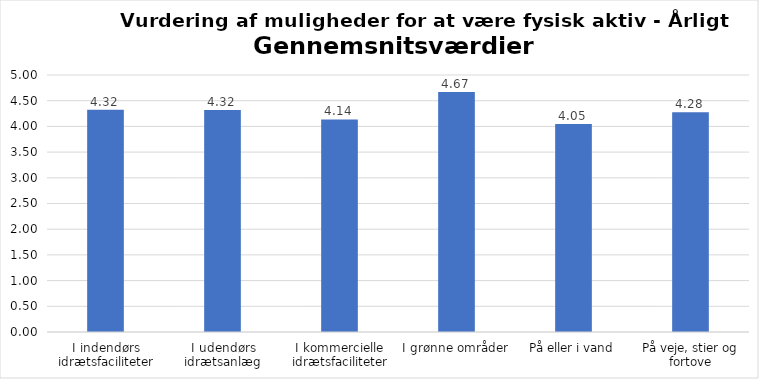
| Category | Gennemsnit |
|---|---|
| I indendørs idrætsfaciliteter | 4.322 |
| I udendørs idrætsanlæg | 4.318 |
| I kommercielle idrætsfaciliteter | 4.136 |
| I grønne områder | 4.669 |
| På eller i vand | 4.046 |
| På veje, stier og fortove | 4.276 |